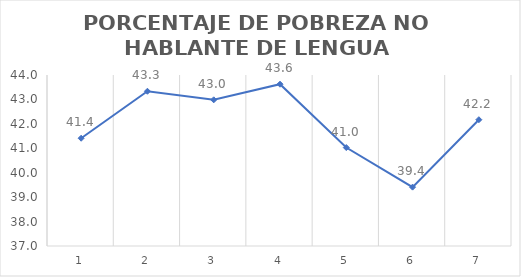
| Category | Series 0 |
|---|---|
| 0 | 41.412 |
| 1 | 43.335 |
| 2 | 42.984 |
| 3 | 43.623 |
| 4 | 41.03 |
| 5 | 39.41 |
| 6 | 42.17 |